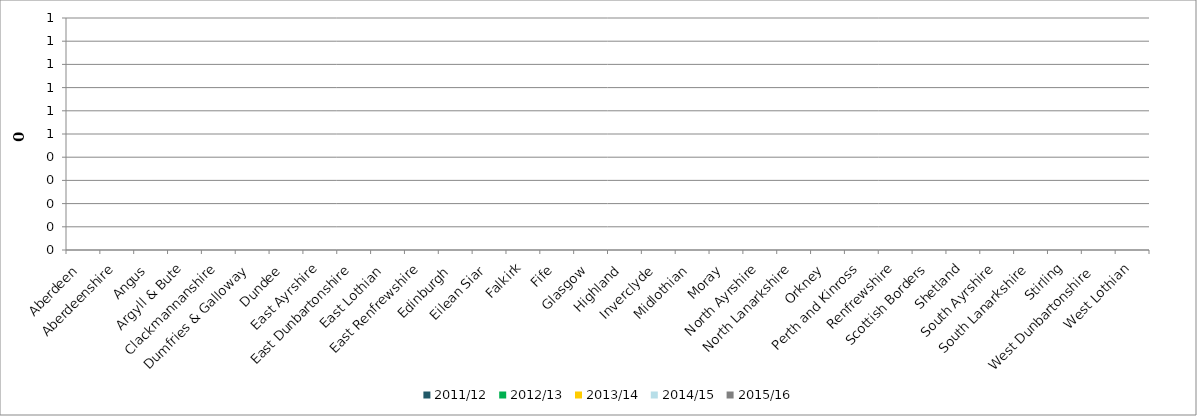
| Category | 2011/12 | 2012/13 | 2013/14 | 2014/15 | 2015/16 |
|---|---|---|---|---|---|
| Aberdeen | 0 | 0 | 0 | 0 | 0 |
| Aberdeenshire | 0 | 0 | 0 | 0 | 0 |
| Angus | 0 | 0 | 0 | 0 | 0 |
| Argyll & Bute | 0 | 0 | 0 | 0 | 0 |
| Clackmannanshire | 0 | 0 | 0 | 0 | 0 |
| Dumfries & Galloway | 0 | 0 | 0 | 0 | 0 |
| Dundee | 0 | 0 | 0 | 0 | 0 |
| East Ayrshire | 0 | 0 | 0 | 0 | 0 |
| East Dunbartonshire | 0 | 0 | 0 | 0 | 0 |
| East Lothian | 0 | 0 | 0 | 0 | 0 |
| East Renfrewshire | 0 | 0 | 0 | 0 | 0 |
| Edinburgh | 0 | 0 | 0 | 0 | 0 |
| Eilean Siar | 0 | 0 | 0 | 0 | 0 |
| Falkirk | 0 | 0 | 0 | 0 | 0 |
| Fife | 0 | 0 | 0 | 0 | 0 |
| Glasgow | 0 | 0 | 0 | 0 | 0 |
| Highland | 0 | 0 | 0 | 0 | 0 |
| Inverclyde | 0 | 0 | 0 | 0 | 0 |
| Midlothian | 0 | 0 | 0 | 0 | 0 |
| Moray | 0 | 0 | 0 | 0 | 0 |
| North Ayrshire | 0 | 0 | 0 | 0 | 0 |
| North Lanarkshire | 0 | 0 | 0 | 0 | 0 |
| Orkney | 0 | 0 | 0 | 0 | 0 |
| Perth and Kinross | 0 | 0 | 0 | 0 | 0 |
| Renfrewshire | 0 | 0 | 0 | 0 | 0 |
| Scottish Borders | 0 | 0 | 0 | 0 | 0 |
| Shetland | 0 | 0 | 0 | 0 | 0 |
| South Ayrshire | 0 | 0 | 0 | 0 | 0 |
| South Lanarkshire | 0 | 0 | 0 | 0 | 0 |
| Stirling | 0 | 0 | 0 | 0 | 0 |
| West Dunbartonshire | 0 | 0 | 0 | 0 | 0 |
| West Lothian | 0 | 0 | 0 | 0 | 0 |